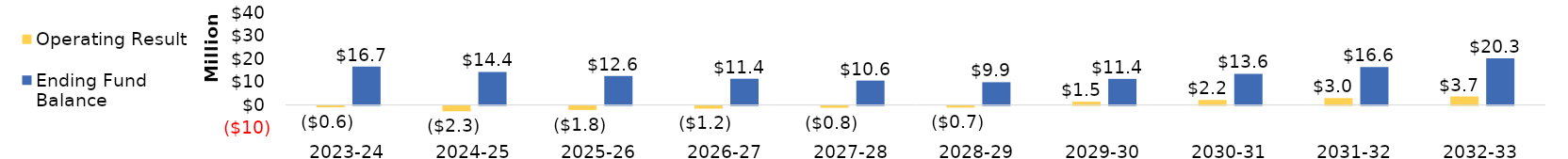
| Category | Operating Result | Ending Fund Balance |
|---|---|---|
| 2023-24 | -606612.692 | 16727208.308 |
| 2024-25 | -2339204.233 | 14388004.076 |
| 2025-26 | -1756893.314 | 12631110.762 |
| 2026-27 | -1182186.237 | 11448924.525 |
| 2027-28 | -816557.282 | 10632367.243 |
| 2028-29 | -705331.486 | 9927035.757 |
| 2029-30 | 1454832.886 | 11381868.643 |
| 2030-31 | 2190740.275 | 13572608.918 |
| 2031-32 | 2998307.915 | 16570916.833 |
| 2032-33 | 3707596.118 | 20278512.951 |